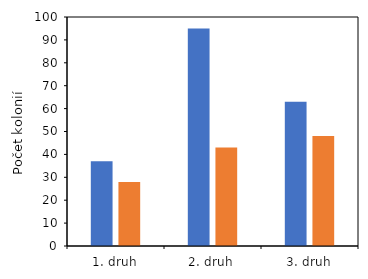
| Category | kontrola | přípravek |
|---|---|---|
| 1. druh | 37 | 28 |
| 2. druh | 95 | 43 |
| 3. druh | 63 | 48 |